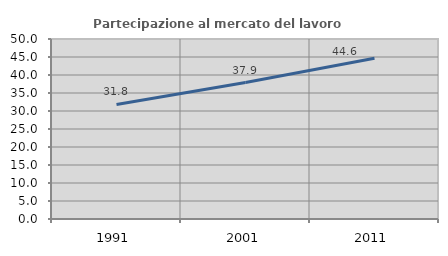
| Category | Partecipazione al mercato del lavoro  femminile |
|---|---|
| 1991.0 | 31.814 |
| 2001.0 | 37.898 |
| 2011.0 | 44.627 |